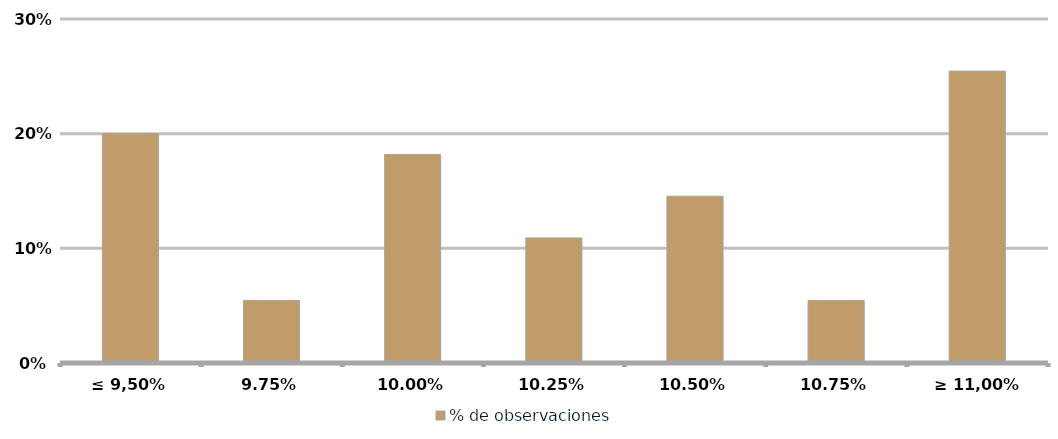
| Category | % de observaciones  |
|---|---|
| ≤ 9,50% | 0.2 |
| 9,75% | 0.055 |
| 10,00% | 0.182 |
| 10,25% | 0.109 |
| 10,50% | 0.145 |
| 10,75% | 0.055 |
| ≥ 11,00% | 0.255 |